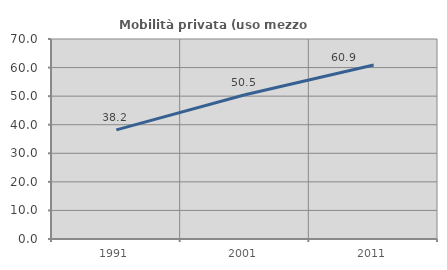
| Category | Mobilità privata (uso mezzo privato) |
|---|---|
| 1991.0 | 38.188 |
| 2001.0 | 50.464 |
| 2011.0 | 60.916 |